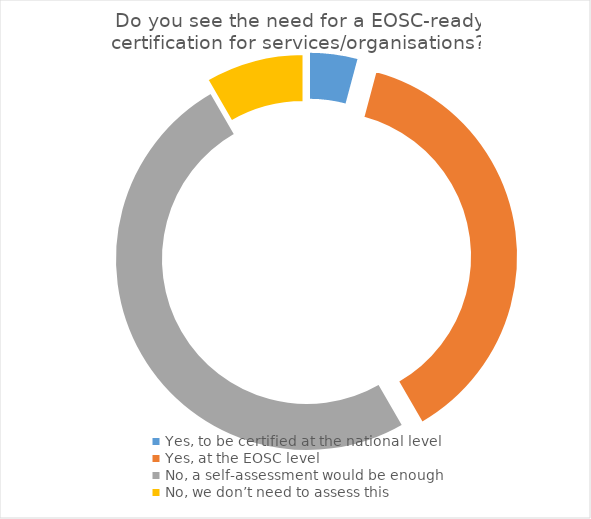
| Category | Series 0 |
|---|---|
| Yes, to be certified at the national level | 1 |
| Yes, at the EOSC level | 9 |
| No, a self-assessment would be enough | 12 |
| No, we don’t need to assess this | 2 |